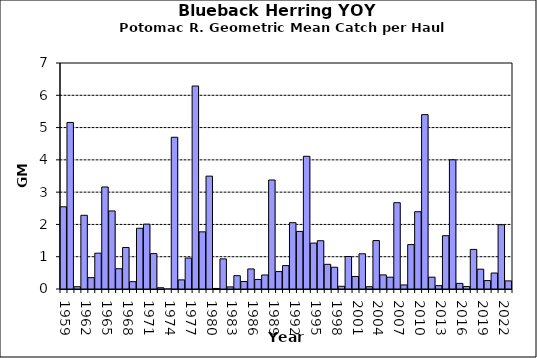
| Category | Series 0 |
|---|---|
| 1959.0 | 2.546 |
| 1960.0 | 5.159 |
| 1961.0 | 0.071 |
| 1962.0 | 2.283 |
| 1963.0 | 0.352 |
| 1964.0 | 1.109 |
| 1965.0 | 3.16 |
| 1966.0 | 2.418 |
| 1967.0 | 0.627 |
| 1968.0 | 1.285 |
| 1969.0 | 0.227 |
| 1970.0 | 1.881 |
| 1971.0 | 2.009 |
| 1972.0 | 1.096 |
| 1973.0 | 0.039 |
| 1974.0 | 0 |
| 1975.0 | 4.7 |
| 1976.0 | 0.282 |
| 1977.0 | 0.959 |
| 1978.0 | 6.287 |
| 1979.0 | 1.77 |
| 1980.0 | 3.496 |
| 1981.0 | 0.017 |
| 1982.0 | 0.933 |
| 1983.0 | 0.065 |
| 1984.0 | 0.413 |
| 1985.0 | 0.233 |
| 1986.0 | 0.62 |
| 1987.0 | 0.296 |
| 1988.0 | 0.434 |
| 1989.0 | 3.376 |
| 1990.0 | 0.539 |
| 1991.0 | 0.724 |
| 1992.0 | 2.054 |
| 1993.0 | 1.784 |
| 1994.0 | 4.11 |
| 1995.0 | 1.422 |
| 1996.0 | 1.495 |
| 1997.0 | 0.764 |
| 1998.0 | 0.673 |
| 1999.0 | 0.084 |
| 2000.0 | 1.007 |
| 2001.0 | 0.388 |
| 2002.0 | 1.09 |
| 2003.0 | 0.071 |
| 2004.0 | 1.5 |
| 2005.0 | 0.436 |
| 2006.0 | 0.366 |
| 2007.0 | 2.674 |
| 2008.0 | 0.126 |
| 2009.0 | 1.376 |
| 2010.0 | 2.394 |
| 2011.0 | 5.401 |
| 2012.0 | 0.367 |
| 2013.0 | 0.104 |
| 2014.0 | 1.651 |
| 2015.0 | 4.002 |
| 2016.0 | 0.175 |
| 2017.0 | 0.076 |
| 2018.0 | 1.226 |
| 2019.0 | 0.614 |
| 2020.0 | 0.26 |
| 2021.0 | 0.495 |
| 2022.0 | 1.991 |
| 2023.0 | 0.251 |